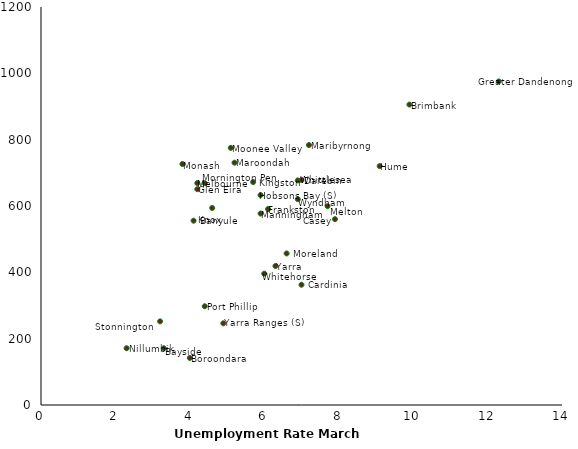
| Category | Unemployment Rate March 2016 |
|---|---|
| 4.1 | 555.704 |
| 3.3 | 171.15 |
| 4.0 | 141.934 |
| 9.9 | 905.773 |
| 7.0 | 362.587 |
| 7.9 | 560.354 |
| 6.9 | 677.096 |
| 6.1 | 590.815 |
| 4.2 | 650.674 |
| 12.3 | 975.581 |
| 5.9 | 632.903 |
| 9.1 | 720.385 |
| 5.7 | 672.155 |
| 4.6 | 594.129 |
| 5.9 | 577.283 |
| 7.2 | 783.792 |
| 5.2 | 730.632 |
| 4.2 | 668.92 |
| 7.7 | 599.538 |
| 3.8 | 726.598 |
| 5.1 | 775.354 |
| 6.6 | 456.967 |
| 4.4 | 668.913 |
| 2.3 | 171.174 |
| 4.4 | 297.696 |
| 3.2 | 252.157 |
| 6.0 | 396.096 |
| 7.0 | 678.557 |
| 6.9 | 620.483 |
| 6.3 | 419.178 |
| 4.9 | 246.34 |